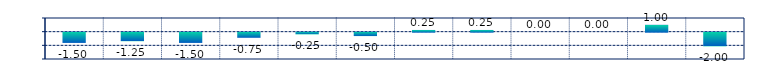
| Category | Series 0 |
|---|---|
| JAN | -1.5 |
| MAR | -1.25 |
| MAY | -1.5 |
| JUL | -0.75 |
| AUG | -0.25 |
| SEP | -0.5 |
| NOV | 0.25 |
| JAN | 0.25 |
| MAR | 0 |
| MAY | 0 |
| JUL | 1 |
| AUG | -2 |